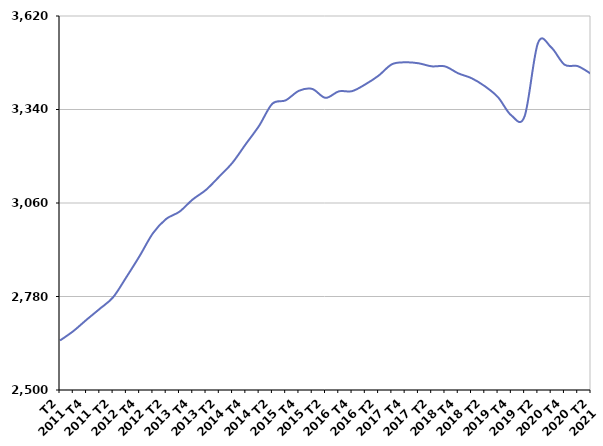
| Category | De 25 à 49 ans |
|---|---|
| T2
2011 | 2648.2 |
| T3
2011 | 2676.2 |
| T4
2011 | 2710.4 |
| T1
2012 | 2743.3 |
| T2
2012 | 2777.7 |
| T3
2012 | 2838 |
| T4
2012 | 2901.4 |
| T1
2013 | 2969.4 |
| T2
2013 | 3012.3 |
| T3
2013 | 3034 |
| T4
2013 | 3070.7 |
| T1
2014 | 3099.4 |
| T2
2014 | 3139.3 |
| T3
2014 | 3181.1 |
| T4
2014 | 3236.7 |
| T1
2015 | 3291.3 |
| T2
2015 | 3357.5 |
| T3
2015 | 3367.4 |
| T4
2015 | 3396 |
| T1
2016 | 3401.6 |
| T2
2016 | 3374.9 |
| T3
2016 | 3394.3 |
| T4
2016 | 3395 |
| T1
2017 | 3415.3 |
| T2
2017 | 3441.4 |
| T3
2017 | 3475.4 |
| T4
2017 | 3481.3 |
| T1
2018 | 3478.5 |
| T2
2018 | 3469.3 |
| T3
2018 | 3469.1 |
| T4
2018 | 3448.3 |
| T1
2019 | 3433.8 |
| T2
2019 | 3409.8 |
| T3
2019 | 3376.6 |
| T4
2019 | 3322.3 |
| T1
2020 | 3319.8 |
| T2
2020 | 3538.6 |
| T3
2020 | 3526.2 |
| T4
2020 | 3474.4 |
| T1
2021 | 3469.8 |
| T2
2021 | 3446.9 |